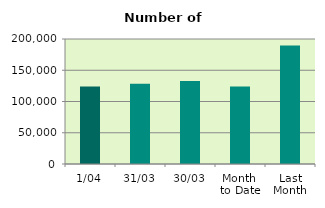
| Category | Series 0 |
|---|---|
| 1/04 | 123862 |
| 31/03 | 128400 |
| 30/03 | 132948 |
| Month 
to Date | 123862 |
| Last
Month | 189416.87 |